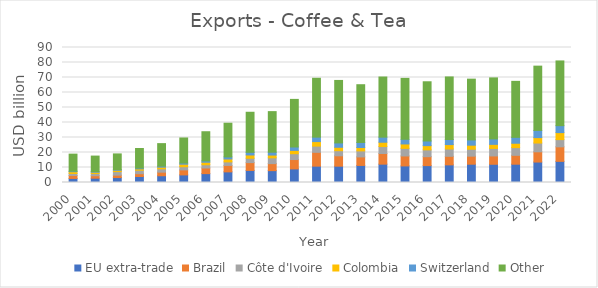
| Category | EU extra-trade | Brazil | Côte d'Ivoire | Colombia | Switzerland | Other |
|---|---|---|---|---|---|---|
| 2000.0 | 2709.326 | 1980.907 | 1321.091 | 1187.385 | 341.263 | 11368.596 |
| 2001.0 | 2869.399 | 1624.992 | 1468.565 | 887.325 | 413.029 | 10350.845 |
| 2002.0 | 3283.258 | 1617.279 | 2359.951 | 896.214 | 438.08 | 10462.342 |
| 2003.0 | 3982.968 | 1888.066 | 2305.56 | 925.14 | 519.964 | 13054.276 |
| 2004.0 | 4492.52 | 2399.219 | 2239.701 | 1099.402 | 667.286 | 15020.797 |
| 2005.0 | 5059.778 | 3346.404 | 2106.848 | 1683.224 | 778.066 | 16709.38 |
| 2006.0 | 5920.717 | 3763.126 | 2135.08 | 1690.52 | 877.295 | 19460.76 |
| 2007.0 | 7086.041 | 4298.111 | 2350.705 | 1958.495 | 1342.206 | 22484.528 |
| 2008.0 | 8049.964 | 5216.685 | 2889.351 | 2195.617 | 1763.668 | 26709.396 |
| 2009.0 | 7908.293 | 4681.725 | 3839.264 | 1861.751 | 1895.132 | 27065.908 |
| 2010.0 | 9069.584 | 6241.905 | 3870 | 2229.431 | 2269.508 | 31726.748 |
| 2011.0 | 10900.626 | 9223.669 | 4132.814 | 3024.582 | 2962.499 | 39238.164 |
| 2012.0 | 10884.616 | 6919.181 | 3395.369 | 2280.407 | 2898.19 | 41658.788 |
| 2013.0 | 11379.935 | 5688.994 | 3995.865 | 2259.327 | 3360.92 | 38506.758 |
| 2014.0 | 12231.828 | 7118.123 | 4613.641 | 2885.272 | 3388.134 | 40090.964 |
| 2015.0 | 11059.713 | 6637.308 | 5068.229 | 2940.665 | 3099.615 | 40613.061 |
| 2016.0 | 11266.562 | 5947 | 4544.237 | 2820.626 | 3099.931 | 39474.307 |
| 2017.0 | 11749.686 | 5719.224 | 4884.432 | 2921.4 | 3391.782 | 41714.137 |
| 2018.0 | 12203.345 | 5366.127 | 4624.036 | 2679.091 | 3506.02 | 40523.892 |
| 2019.0 | 12150.368 | 5556.048 | 5005.613 | 2717.522 | 3624.774 | 40680.713 |
| 2020.0 | 12198.795 | 5922.796 | 5133.859 | 2914.772 | 3927.545 | 37330.621 |
| 2021.0 | 13640.8 | 6832.24 | 5837.034 | 3619.406 | 4782.227 | 42861.001 |
| 2022.0 | 14089.354 | 9698.355 | 4807.54 | 4670.33 | 4640.23 | 43139.06 |